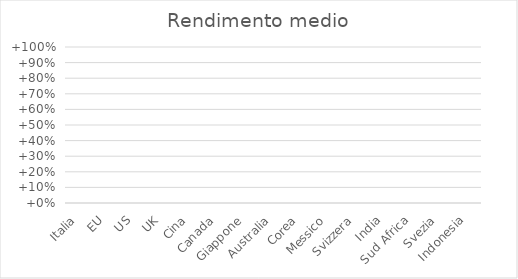
| Category | Rendimento medio |
|---|---|
| Italia | 0 |
| EU | 0 |
| US | 0 |
| UK | 0 |
| Cina | 0 |
| Canada | 0 |
| Giappone | 0 |
| Australia | 0 |
| Corea | 0 |
| Messico | 0 |
| Svizzera | 0 |
| India | 0 |
| Sud Africa | 0 |
| Svezia | 0 |
| Indonesia | 0 |